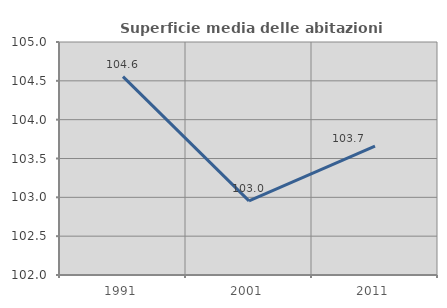
| Category | Superficie media delle abitazioni occupate |
|---|---|
| 1991.0 | 104.555 |
| 2001.0 | 102.954 |
| 2011.0 | 103.659 |